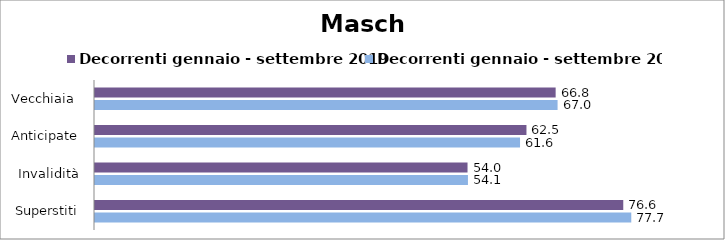
| Category | Decorrenti gennaio - settembre 2019 | Decorrenti gennaio - settembre 2020 |
|---|---|---|
| Vecchiaia  | 66.76 | 67.04 |
| Anticipate | 62.53 | 61.6 |
| Invalidità | 53.99 | 54.05 |
| Superstiti | 76.56 | 77.72 |